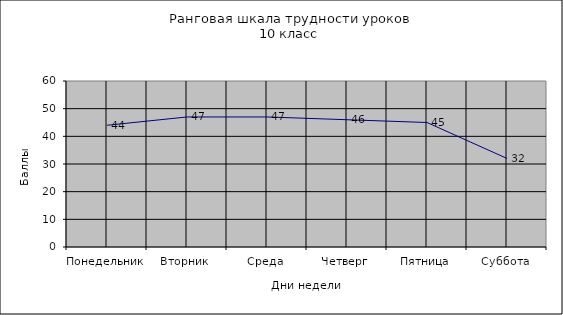
| Category | Series 0 |
|---|---|
| Понедельник | 44 |
| Вторник | 47 |
| Среда | 47 |
| Четверг | 46 |
| Пятница | 45 |
| Суббота | 32 |